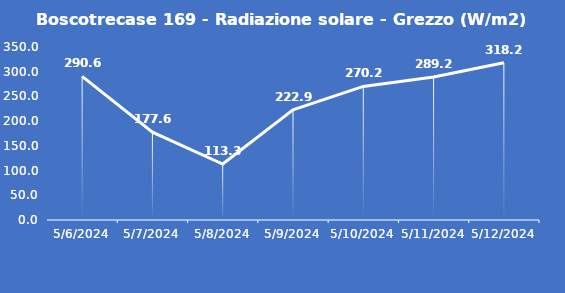
| Category | Boscotrecase 169 - Radiazione solare - Grezzo (W/m2) |
|---|---|
| 5/6/24 | 290.6 |
| 5/7/24 | 177.6 |
| 5/8/24 | 113.3 |
| 5/9/24 | 222.9 |
| 5/10/24 | 270.2 |
| 5/11/24 | 289.2 |
| 5/12/24 | 318.2 |